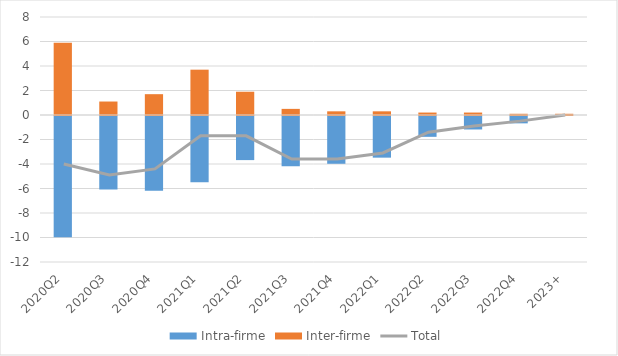
| Category | Intra-firme | Inter-firme |
|---|---|---|
| 2020Q2 | -9.9 | 5.9 |
| 2020Q3 | -6 | 1.1 |
| 2020Q4 | -6.1 | 1.7 |
| 2021Q1 | -5.4 | 3.7 |
| 2021Q2 | -3.6 | 1.9 |
| 2021Q3 | -4.1 | 0.5 |
| 2021Q4 | -3.9 | 0.3 |
| 2022Q1 | -3.4 | 0.3 |
| 2022Q2 | -1.7 | 0.2 |
| 2022Q3 | -1.1 | 0.2 |
| 2022Q4 | -0.6 | 0.1 |
| 2023+ | 0 | 0.1 |